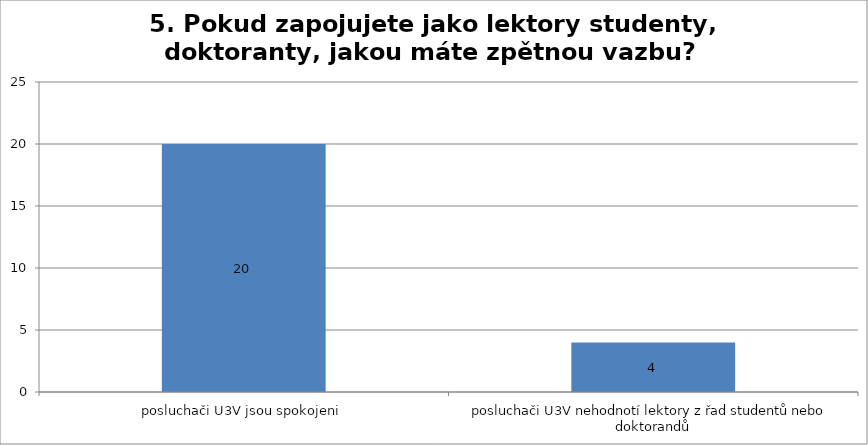
| Category | Series 0 |
|---|---|
| posluchači U3V jsou spokojeni | 20 |
| posluchači U3V nehodnotí lektory z řad studentů nebo doktorandů | 4 |